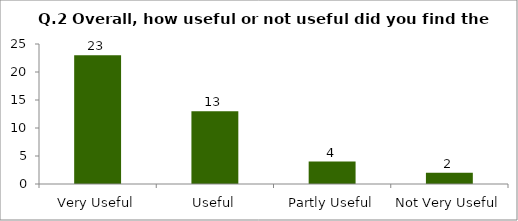
| Category | Q.2 Overall, how useful or not useful did you find the Session? |
|---|---|
| Very Useful | 23 |
| Useful | 13 |
| Partly Useful | 4 |
| Not Very Useful | 2 |